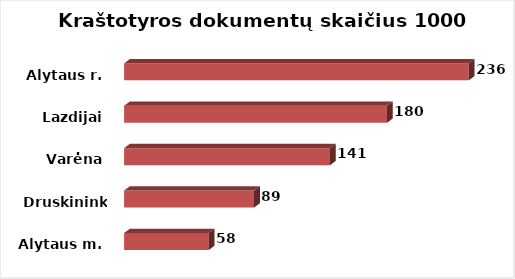
| Category | Series 0 |
|---|---|
| Alytaus m. | 58 |
| Druskininkai | 89 |
| Varėna | 141 |
| Lazdijai | 180 |
| Alytaus r. | 236 |